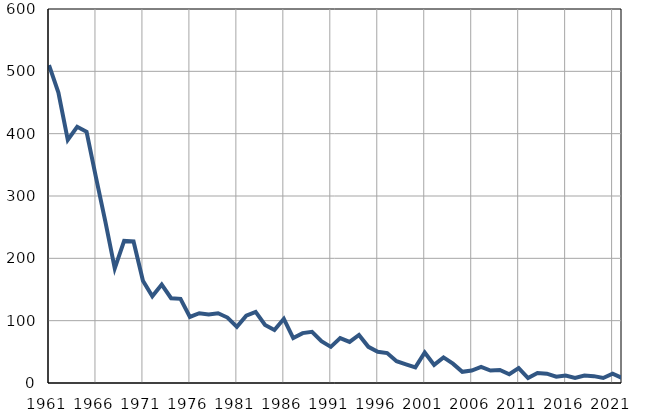
| Category | Умрла 
одојчад |
|---|---|
| 1961.0 | 510 |
| 1962.0 | 466 |
| 1963.0 | 390 |
| 1964.0 | 411 |
| 1965.0 | 403 |
| 1966.0 | 330 |
| 1967.0 | 259 |
| 1968.0 | 184 |
| 1969.0 | 228 |
| 1970.0 | 227 |
| 1971.0 | 164 |
| 1972.0 | 139 |
| 1973.0 | 158 |
| 1974.0 | 136 |
| 1975.0 | 135 |
| 1976.0 | 106 |
| 1977.0 | 112 |
| 1978.0 | 110 |
| 1979.0 | 112 |
| 1980.0 | 105 |
| 1981.0 | 90 |
| 1982.0 | 108 |
| 1983.0 | 114 |
| 1984.0 | 93 |
| 1985.0 | 85 |
| 1986.0 | 103 |
| 1987.0 | 72 |
| 1988.0 | 80 |
| 1989.0 | 82 |
| 1990.0 | 67 |
| 1991.0 | 58 |
| 1992.0 | 72 |
| 1993.0 | 66 |
| 1994.0 | 77 |
| 1995.0 | 58 |
| 1996.0 | 50 |
| 1997.0 | 48 |
| 1998.0 | 35 |
| 1999.0 | 30 |
| 2000.0 | 25 |
| 2001.0 | 49 |
| 2002.0 | 29 |
| 2003.0 | 41 |
| 2004.0 | 31 |
| 2005.0 | 18 |
| 2006.0 | 20 |
| 2007.0 | 26 |
| 2008.0 | 20 |
| 2009.0 | 21 |
| 2010.0 | 14 |
| 2011.0 | 24 |
| 2012.0 | 8 |
| 2013.0 | 16 |
| 2014.0 | 15 |
| 2015.0 | 10 |
| 2016.0 | 12 |
| 2017.0 | 8 |
| 2018.0 | 12 |
| 2019.0 | 11 |
| 2020.0 | 8 |
| 2021.0 | 15 |
| 2022.0 | 8 |